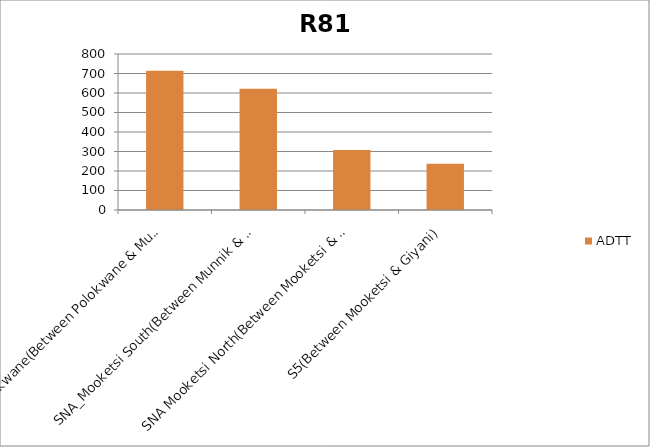
| Category | ADTT |
|---|---|
| R81 Polokwane(Between Polokwane & Munnik) | 714.253 |
| SNA_Mooketsi South(Between Munnik & Mooketsi) | 621.257 |
| SNA Mooketsi North(Between Mooketsi & Jamela) | 307.249 |
| S5(Between Mooketsi & Giyani) | 237.411 |